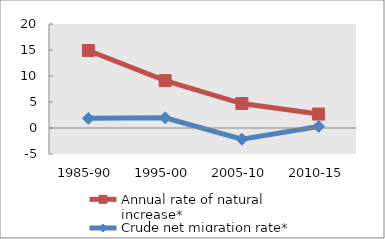
| Category | Annual rate of natural increase* | Crude net migration rate* |
|---|---|---|
| 1985-90 | 14.9 | 1.859 |
| 1995-00 | 9.112 | 1.964 |
| 2005-10 | 4.707 | -2.152 |
| 2010-15 | 2.686 | 0.299 |